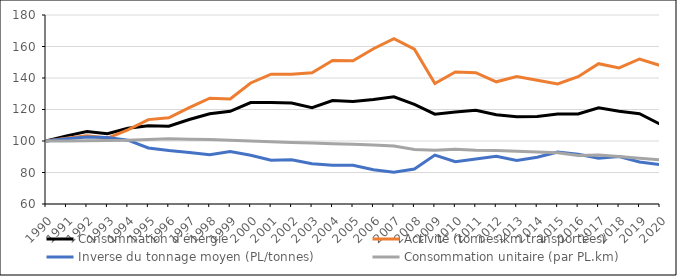
| Category | Consommation d'énergie | Activité (tonnes-km transportées) | Inverse du tonnage moyen (PL/tonnes) | Consommation unitaire (par PL.km) |
|---|---|---|---|---|
| 1990.0 | 100 | 100 | 100 | 100 |
| 1991.0 | 103.267 | 101.748 | 101.48 | 100.012 |
| 1992.0 | 106.078 | 103.319 | 102.484 | 100.182 |
| 1993.0 | 104.572 | 101.84 | 102.292 | 100.382 |
| 1994.0 | 108.047 | 107.078 | 100.497 | 100.406 |
| 1995.0 | 109.646 | 113.588 | 95.563 | 101.012 |
| 1996.0 | 109.442 | 114.776 | 93.959 | 101.483 |
| 1997.0 | 113.627 | 121.245 | 92.705 | 101.091 |
| 1998.0 | 117.26 | 127.209 | 91.325 | 100.935 |
| 1999.0 | 118.835 | 126.734 | 93.299 | 100.502 |
| 2000.0 | 124.423 | 136.861 | 90.948 | 99.96 |
| 2001.0 | 124.481 | 142.434 | 87.83 | 99.505 |
| 2002.0 | 124.099 | 142.331 | 88.042 | 99.033 |
| 2003.0 | 121.129 | 143.378 | 85.529 | 98.776 |
| 2004.0 | 125.637 | 151.173 | 84.57 | 98.271 |
| 2005.0 | 125.136 | 150.979 | 84.609 | 97.96 |
| 2006.0 | 126.372 | 158.604 | 81.767 | 97.444 |
| 2007.0 | 128.103 | 164.979 | 80.176 | 96.846 |
| 2008.0 | 123.243 | 158.333 | 82.25 | 94.636 |
| 2009.0 | 117.021 | 136.479 | 91.035 | 94.186 |
| 2010.0 | 118.373 | 143.873 | 86.851 | 94.732 |
| 2011.0 | 119.552 | 143.392 | 88.579 | 94.125 |
| 2012.0 | 116.699 | 137.588 | 90.235 | 93.997 |
| 2013.0 | 115.363 | 140.95 | 87.589 | 93.444 |
| 2014.0 | 115.486 | 138.581 | 89.643 | 92.963 |
| 2015.0 | 117.141 | 136.236 | 92.958 | 92.498 |
| 2016.0 | 117.143 | 140.833 | 91.623 | 90.783 |
| 2017.0 | 121.039 | 149.07 | 89.065 | 91.165 |
| 2018.0 | 118.905 | 146.368 | 90.096 | 90.167 |
| 2019.0 | 117.295 | 152.072 | 86.654 | 89.011 |
| 2020.0 | 110.67 | 147.962 | 85.017 | 87.978 |